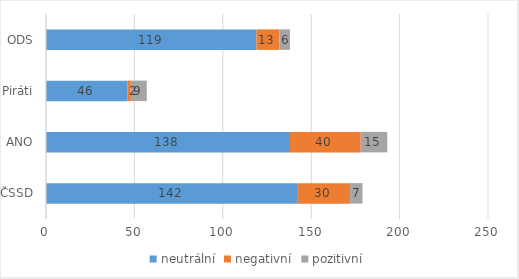
| Category | neutrální | negativní | pozitivní |
|---|---|---|---|
| ČSSD | 142 | 30 | 7 |
| ANO | 138 | 40 | 15 |
| Piráti | 46 | 2 | 9 |
| ODS | 119 | 13 | 6 |